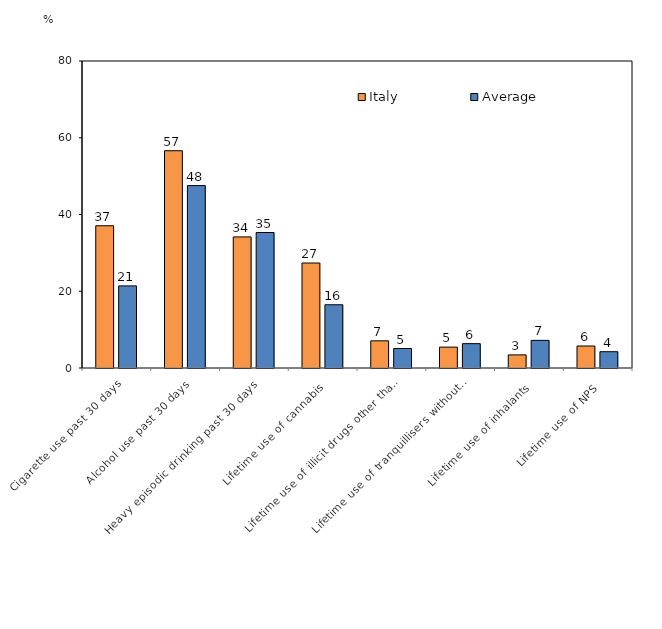
| Category | Italy | Average |
|---|---|---|
| Cigarette use past 30 days | 37.07 | 21.397 |
| Alcohol use past 30 days | 56.62 | 47.531 |
| Heavy episodic drinking past 30 days | 34.16 | 35.309 |
| Lifetime use of cannabis | 27.36 | 16.48 |
| Lifetime use of illicit drugs other than cannabis | 7.08 | 5.079 |
| Lifetime use of tranquillisers without prescription  | 5.44 | 6.34 |
| Lifetime use of inhalants | 3.42 | 7.202 |
| Lifetime use of NPS | 5.73 | 4.246 |